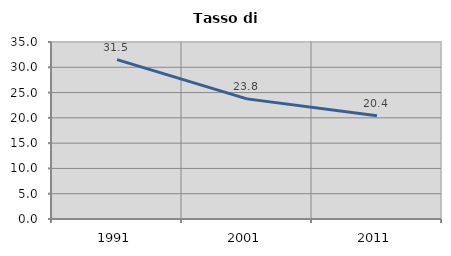
| Category | Tasso di disoccupazione   |
|---|---|
| 1991.0 | 31.503 |
| 2001.0 | 23.753 |
| 2011.0 | 20.397 |